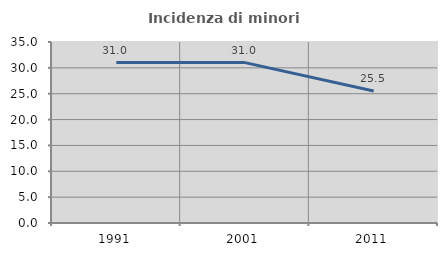
| Category | Incidenza di minori stranieri |
|---|---|
| 1991.0 | 31.034 |
| 2001.0 | 31.016 |
| 2011.0 | 25.517 |